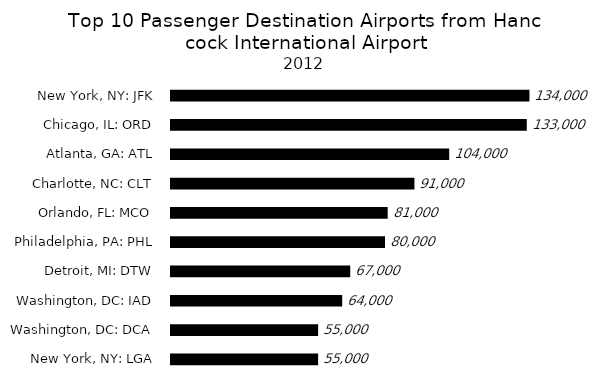
| Category | Series 0 |
|---|---|
| New York, NY: LGA | 55000 |
| Washington, DC: DCA | 55000 |
| Washington, DC: IAD | 64000 |
| Detroit, MI: DTW | 67000 |
| Philadelphia, PA: PHL | 80000 |
| Orlando, FL: MCO | 81000 |
| Charlotte, NC: CLT | 91000 |
| Atlanta, GA: ATL | 104000 |
| Chicago, IL: ORD | 133000 |
| New York, NY: JFK | 134000 |